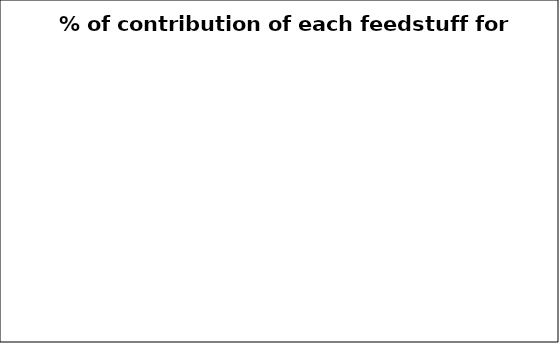
| Category | % of contribution off each feedstuff for Energy | Series 1 |
|---|---|---|
| 0.0 | 0 |  |
| 0.0 | 0 |  |
| 0.0 | 0 |  |
| 0.0 | 0 |  |
| 0.0 | 0 |  |
| 0.0 | 0 |  |
| 0.0 | 0 |  |
| 0.0 | 0 |  |
| 0.0 | 0 |  |
| 0.0 | 0 |  |
| 0.0 | 0 |  |
| 0.0 | 0 |  |